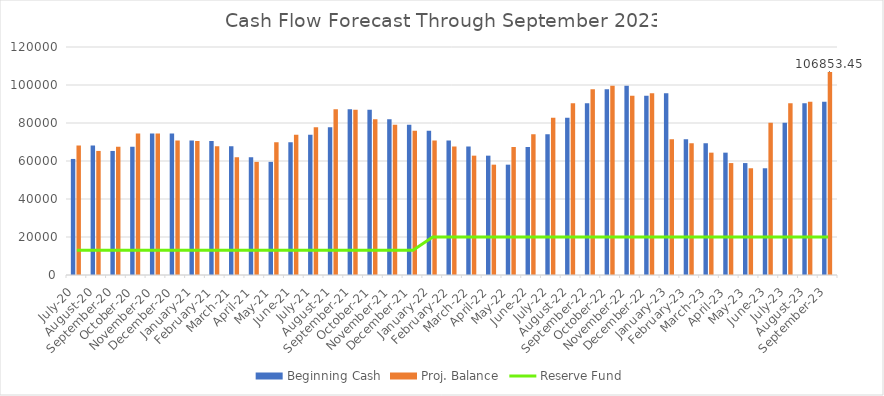
| Category | Beginning Cash | Proj. Balance |
|---|---|---|
| 2020-07-01 | 61082.25 | 68155.56 |
| 2020-08-01 | 68155.56 | 65293.29 |
| 2020-09-01 | 65293.29 | 67527.38 |
| 2020-10-01 | 67527.38 | 74493.79 |
| 2020-11-01 | 74493.79 | 74425.4 |
| 2020-12-01 | 74425.4 | 70837.56 |
| 2021-01-01 | 70837.56 | 70557.78 |
| 2021-02-01 | 70557.78 | 67728.94 |
| 2021-03-21 | 67728.94 | 61977.57 |
| 2021-04-21 | 61977.57 | 59550.07 |
| 2021-05-21 | 59550.07 | 69818.23 |
| 2021-06-21 | 69818.23 | 73869.56 |
| 2021-07-21 | 73869.56 | 77756.07 |
| 2021-08-21 | 77756.07 | 87247.52 |
| 2021-09-21 | 87247.52 | 86985.19 |
| 2021-10-21 | 86985.19 | 81917.02 |
| 2021-11-21 | 81917.02 | 79086.2 |
| 2021-12-21 | 79086.2 | 75895.87 |
| 2022-01-21 | 75895.87 | 70768.32 |
| 2022-02-21 | 70768.32 | 67575.89 |
| 2022-03-21 | 67575.89 | 62809.15 |
| 2022-04-21 | 62809.15 | 58067.17 |
| 2022-05-21 | 58067.1 | 67422.67 |
| 2022-06-21 | 67422.67 | 74098.48 |
| 2022-07-21 | 74098.48 | 82778.83 |
| 2022-08-21 | 82778.83 | 90371.69 |
| 2022-09-21 | 90371.69 | 97754.59 |
| 2022-10-21 | 97754.59 | 99629.89 |
| 2022-11-21 | 99629.89 | 94406.16 |
| 2022-12-21 | 94406.16 | 95684.13 |
| 2023-01-21 | 95684.13 | 71382.8 |
| 2023-02-21 | 71382.8 | 69338.37 |
| 2023-03-21 | 69338.37 | 64391.31 |
| 2023-04-21 | 64391.31 | 58906.75 |
| 2023-05-21 | 58906.75 | 56177.05 |
| 2023-06-21 | 56177.05 | 80178.09 |
| 2023-07-21 | 80178.09 | 90435.92 |
| 2023-08-21 | 90435.92 | 91127.6 |
| 2023-09-21 | 91127.6 | 106853.45 |